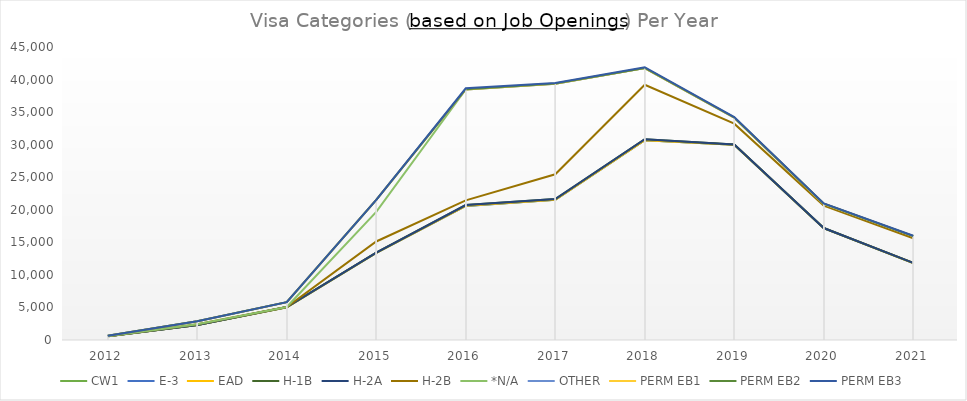
| Category | CW1 | E-3 | EAD | H-1B | H-2A | H-2B | *N/A | OTHER | PERM EB1 | PERM EB2 | PERM EB3 |
|---|---|---|---|---|---|---|---|---|---|---|---|
| 2012.0 | 569 | 0 | 0 | 1 | 0 | 2 | 0 | 84 | 0 | 0 | 0 |
| 2013.0 | 2311 | 0 | 0 | 10 | 0 | 113 | 0 | 438 | 0 | 0 | 0 |
| 2014.0 | 5017 | 0 | 0 | 52 | 0 | 1 | 0 | 737 | 0 | 0 | 0 |
| 2015.0 | 13385 | 0 | 3 | 32 | 0 | 1713 | 4551 | 1836 | 0 | 0 | 0 |
| 2016.0 | 20585 | 0 | 23 | 126 | 0 | 709 | 17036 | 0 | 0 | 35 | 138 |
| 2017.0 | 21518 | 0 | 5 | 121 | 4 | 3810 | 13907 | 0 | 0 | 36 | 85 |
| 2018.0 | 30678 | 0 | 4 | 151 | 15 | 8359 | 2550 | 0 | 0 | 20 | 125 |
| 2019.0 | 29992 | 0 | 5 | 37 | 0 | 3185 | 921 | 0 | 3 | 37 | 66 |
| 2020.0 | 17163 | 0 | 0 | 32 | 0 | 3445 | 273 | 10 | 0 | 9 | 56 |
| 2021.0 | 11805 | 7 | 11 | 25 | 0 | 3786 | 311 | 0 | 2 | 15 | 55 |